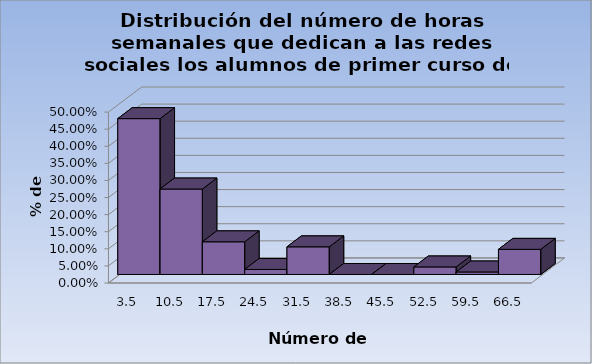
| Category | Series 0 |
|---|---|
| 3.5 | 0.456 |
| 10.5 | 0.25 |
| 17.5 | 0.096 |
| 24.5 | 0.015 |
| 31.5 | 0.081 |
| 38.5 | 0 |
| 45.5 | 0 |
| 52.5 | 0.022 |
| 59.5 | 0.007 |
| 66.5 | 0.074 |